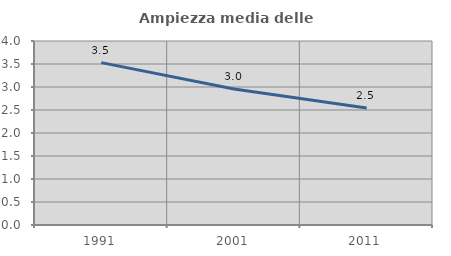
| Category | Ampiezza media delle famiglie |
|---|---|
| 1991.0 | 3.53 |
| 2001.0 | 2.955 |
| 2011.0 | 2.542 |